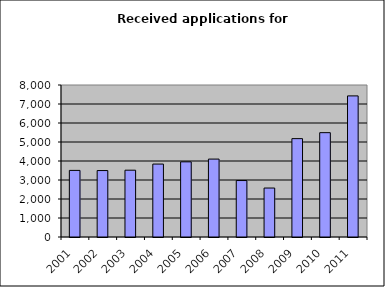
| Category | Series 0 |
|---|---|
| 2001.0 | 3505 |
| 2002.0 | 3497 |
| 2003.0 | 3516 |
| 2004.0 | 3838 |
| 2005.0 | 3956 |
| 2006.0 | 4101 |
| 2007.0 | 2972 |
| 2008.0 | 2577 |
| 2009.0 | 5177 |
| 2010.0 | 5491 |
| 2011.0 | 7426 |